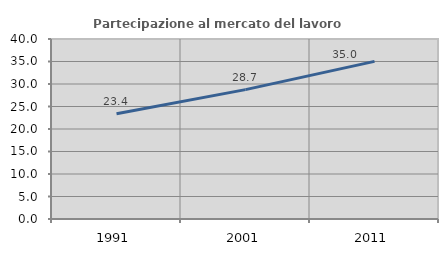
| Category | Partecipazione al mercato del lavoro  femminile |
|---|---|
| 1991.0 | 23.402 |
| 2001.0 | 28.749 |
| 2011.0 | 35.024 |